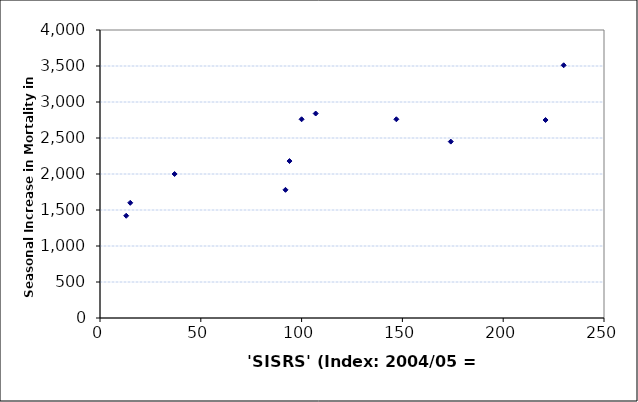
| Category | Seas. Incr. Mort |
|---|---|
| 107.0 | 2840 |
| 100.0 | 2760 |
| 92.0 | 1780 |
| 221.0 | 2750 |
| 94.0 | 2180 |
| 230.0 | 3510 |
| 147.0 | 2760 |
| 174.0 | 2450 |
| 13.0 | 1420 |
| 37.0 | 2000 |
| 15.0 | 1600 |